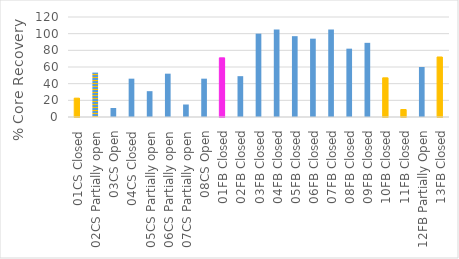
| Category | Recovery % |
|---|---|
| 01CS Closed | 22.6 |
| 02CS Partially open | 53.3 |
| 03CS Open | 10.8 |
| 04CS Closed | 46 |
| 05CS Partially open | 31 |
| 06CS Partially open | 52 |
| 07CS Partially open | 15 |
| 08CS Open | 46 |
| 01FB Closed | 71 |
| 02FB Closed | 49 |
| 03FB Closed | 100 |
| 04FB Closed | 105 |
| 05FB Closed | 97 |
| 06FB Closed | 94 |
| 07FB Closed | 105 |
| 08FB Closed | 82 |
| 09FB Closed | 89 |
| 10FB Closed | 47 |
| 11FB Closed | 9 |
| 12FB Partially Open | 60 |
| 13FB Closed | 72 |